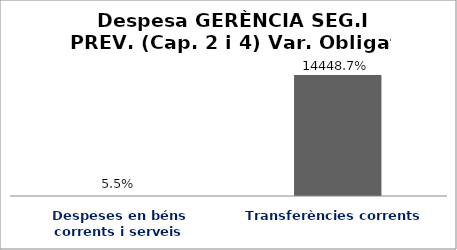
| Category | Series 0 |
|---|---|
| Despeses en béns corrents i serveis | 0.055 |
| Transferències corrents | 144.487 |